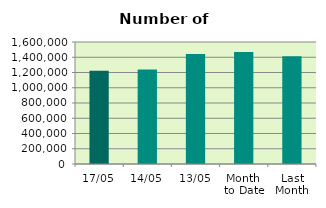
| Category | Series 0 |
|---|---|
| 17/05 | 1221362 |
| 14/05 | 1238708 |
| 13/05 | 1443330 |
| Month 
to Date | 1469226.545 |
| Last
Month | 1414476.2 |